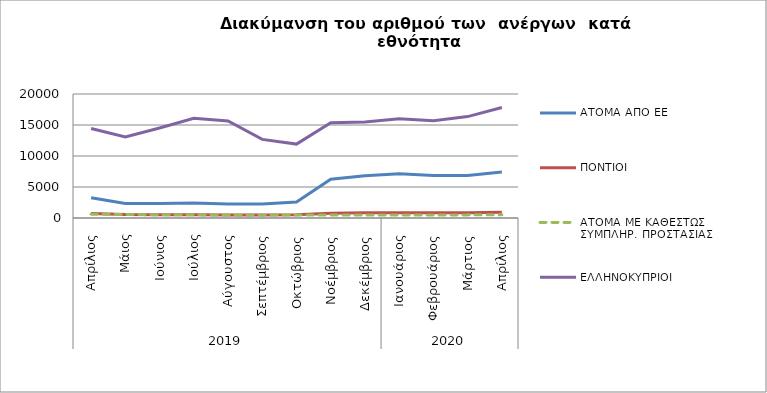
| Category | ΑΤΟΜΑ ΑΠΟ ΕΕ | ΠΟΝΤΙΟΙ | ΑΤΟΜΑ ΜΕ ΚΑΘΕΣΤΩΣ ΣΥΜΠΛΗΡ. ΠΡΟΣΤΑΣΙΑΣ | ΕΛΛΗΝΟΚΥΠΡΙΟΙ |
|---|---|---|---|---|
| 0 | 3279 | 709 | 623 | 14429 |
| 1 | 2334 | 556 | 567 | 13066 |
| 2 | 2332 | 537 | 525 | 14520 |
| 3 | 2405 | 513 | 509 | 16081 |
| 4 | 2278 | 474 | 486 | 15644 |
| 5 | 2278 | 504 | 497 | 12674 |
| 6 | 2586 | 518 | 475 | 11921 |
| 7 | 6266 | 775 | 476 | 15352 |
| 8 | 6810 | 834 | 465 | 15490 |
| 9 | 7137 | 866 | 490 | 15998 |
| 10 | 6870 | 843 | 480 | 15686 |
| 11 | 6874 | 847 | 504 | 16354 |
| 12 | 7404 | 915 | 519 | 17832 |